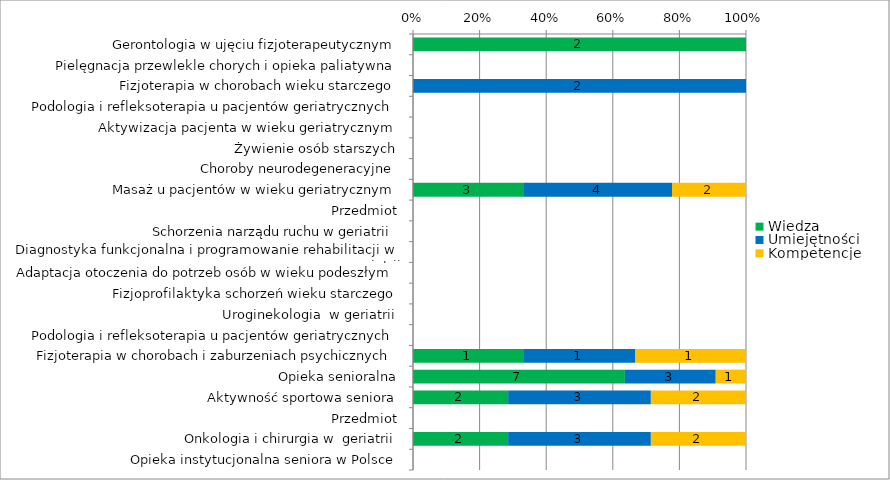
| Category | Wiedza | Umiejętności | Kompetencje |
|---|---|---|---|
| Gerontologia w ujęciu fizjoterapeutycznym | 2 | 0 | 0 |
| Pielęgnacja przewlekle chorych i opieka paliatywna | 0 | 0 | 0 |
| Fizjoterapia w chorobach wieku starczego | 0 | 2 | 0 |
| Podologia i refleksoterapia u pacjentów geriatrycznych | 0 | 0 | 0 |
| Aktywizacja pacjenta w wieku geriatrycznym | 0 | 0 | 0 |
| Żywienie osób starszych | 0 | 0 | 0 |
| Choroby neurodegeneracyjne | 0 | 0 | 0 |
| Masaż u pacjentów w wieku geriatrycznym | 3 | 4 | 2 |
| Przedmiot | 0 | 0 | 0 |
| Schorzenia narządu ruchu w geriatrii | 0 | 0 | 0 |
| Diagnostyka funkcjonalna i programowanie rehabilitacji w geriatrii | 0 | 0 | 0 |
| Adaptacja otoczenia do potrzeb osób w wieku podeszłym | 0 | 0 | 0 |
| Fizjoprofilaktyka schorzeń wieku starczego | 0 | 0 | 0 |
| Uroginekologia  w geriatrii | 0 | 0 | 0 |
| Podologia i refleksoterapia u pacjentów geriatrycznych | 0 | 0 | 0 |
| Fizjoterapia w chorobach i zaburzeniach psychicznych | 1 | 1 | 1 |
| Opieka senioralna | 7 | 3 | 1 |
| Aktywność sportowa seniora | 2 | 3 | 2 |
| Przedmiot | 0 | 0 | 0 |
| Onkologia i chirurgia w  geriatrii | 2 | 3 | 2 |
| Opieka instytucjonalna seniora w Polsce | 0 | 0 | 0 |